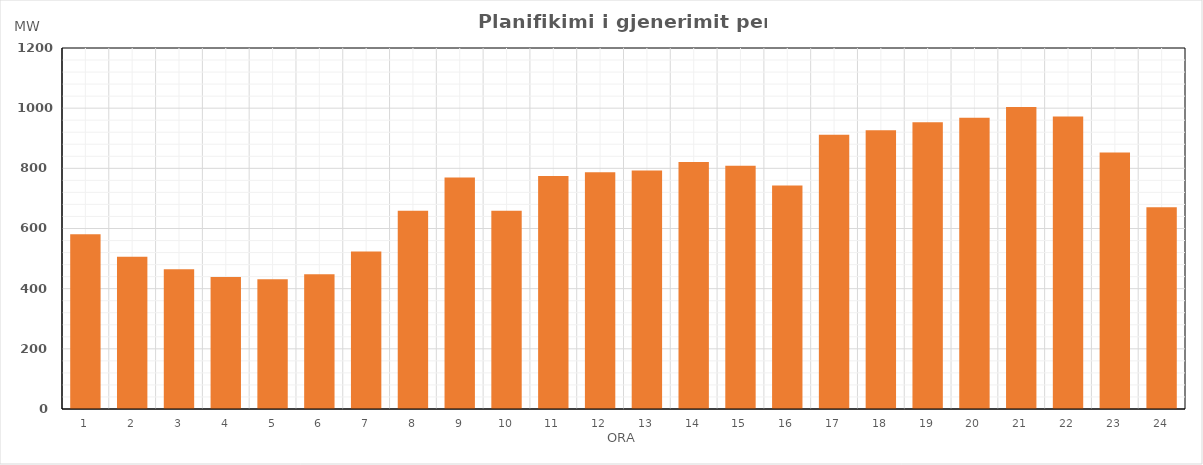
| Category | Max (MW) |
|---|---|
| 0 | 580.7 |
| 1 | 506.2 |
| 2 | 464.4 |
| 3 | 439.07 |
| 4 | 431.57 |
| 5 | 448.24 |
| 6 | 523.14 |
| 7 | 658.92 |
| 8 | 769.86 |
| 9 | 659.06 |
| 10 | 774.47 |
| 11 | 786.67 |
| 12 | 792.97 |
| 13 | 820.9 |
| 14 | 808.92 |
| 15 | 742.97 |
| 16 | 911.24 |
| 17 | 926.96 |
| 18 | 953.22 |
| 19 | 967.8 |
| 20 | 1004.08 |
| 21 | 972.26 |
| 22 | 853.03 |
| 23 | 670.64 |